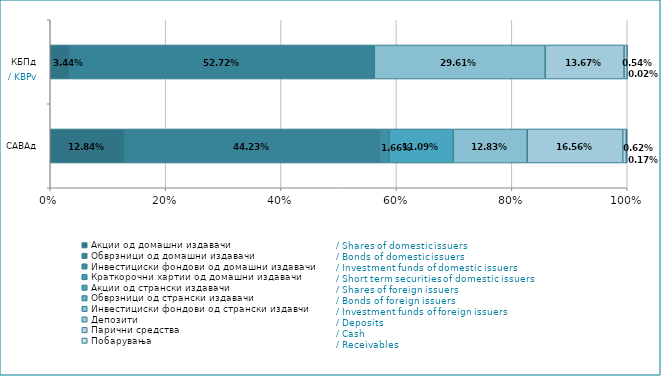
| Category | Акции од домашни издавачи  | Обврзници од домашни издавачи  | Инвестициски фондови од домашни издавачи   | Краткорочни хартии од домашни издавачи   | Акции од странски издавачи   | Обврзници од странски издавачи  | Инвестициски фондови од странски издавчи  | Депозити | Парични средства | Побарувања |
|---|---|---|---|---|---|---|---|---|---|---|
| САВАд | 0.128 | 0.442 | 0.017 | 0 | 0.111 | 0 | 0.128 | 0.166 | 0.006 | 0.002 |
| КБПд | 0.034 | 0.527 | 0 | 0 | 0 | 0 | 0.296 | 0.137 | 0.005 | 0 |